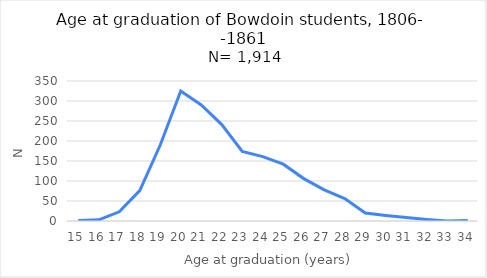
| Category | N |
|---|---|
| 15.0 | 1 |
| 16.0 | 3 |
| 17.0 | 23 |
| 18.0 | 76 |
| 19.0 | 190 |
| 20.0 | 325 |
| 21.0 | 290 |
| 22.0 | 241 |
| 23.0 | 174 |
| 24.0 | 161 |
| 25.0 | 142 |
| 26.0 | 106 |
| 27.0 | 78 |
| 28.0 | 56 |
| 29.0 | 20 |
| 30.0 | 14 |
| 31.0 | 9 |
| 32.0 | 4 |
| 33.0 | 0 |
| 34.0 | 1 |